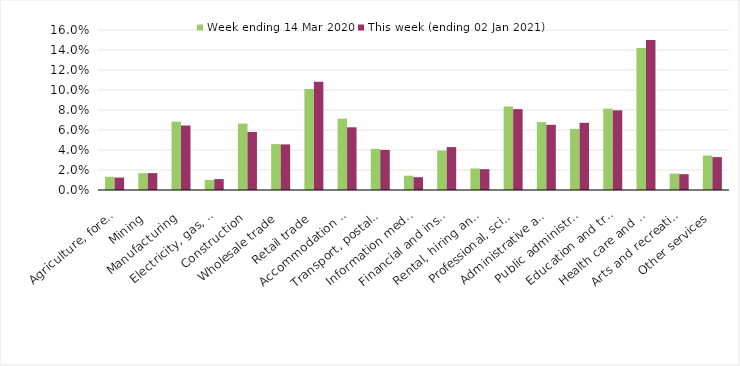
| Category | Week ending 14 Mar 2020 | This week (ending 02 Jan 2021) |
|---|---|---|
| Agriculture, forestry and fishing | 0.013 | 0.012 |
| Mining | 0.017 | 0.017 |
| Manufacturing | 0.068 | 0.064 |
| Electricity, gas, water and waste services | 0.01 | 0.011 |
| Construction | 0.066 | 0.058 |
| Wholesale trade | 0.046 | 0.046 |
| Retail trade | 0.101 | 0.108 |
| Accommodation and food services | 0.071 | 0.063 |
| Transport, postal and warehousing | 0.041 | 0.04 |
| Information media and telecommunications | 0.014 | 0.013 |
| Financial and insurance services | 0.04 | 0.043 |
| Rental, hiring and real estate services | 0.022 | 0.021 |
| Professional, scientific and technical services | 0.084 | 0.081 |
| Administrative and support services | 0.068 | 0.065 |
| Public administration and safety | 0.061 | 0.067 |
| Education and training | 0.081 | 0.08 |
| Health care and social assistance | 0.142 | 0.15 |
| Arts and recreation services | 0.016 | 0.016 |
| Other services | 0.034 | 0.033 |